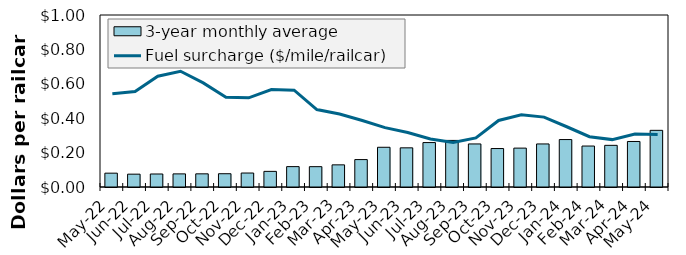
| Category | 3-year monthly average  |
|---|---|
| May-22 | 0.08 |
| Jun-22 | 0.075 |
| Jul-22 | 0.076 |
| Aug-22 | 0.076 |
| Sep-22 | 0.077 |
| Oct-22 | 0.077 |
| Nov-22 | 0.081 |
| Dec-22 | 0.091 |
| Jan-23 | 0.119 |
| Feb-23 | 0.118 |
| Mar-23 | 0.129 |
| Apr-23 | 0.159 |
| May-23 | 0.231 |
| Jun-23 | 0.228 |
| Jul-23 | 0.258 |
| Aug-23 | 0.271 |
| Sep-23 | 0.25 |
| Oct-23 | 0.224 |
| Nov-23 | 0.226 |
| Dec-23 | 0.25 |
| Jan-24 | 0.276 |
| Feb-24 | 0.238 |
| Mar-24 | 0.242 |
| Apr-24 | 0.265 |
| May-24 | 0.329 |